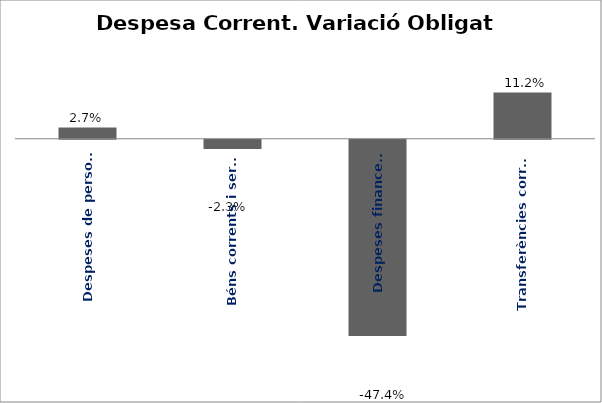
| Category | Series 0 |
|---|---|
| Despeses de personal | 0.027 |
| Béns corrents i serveis | -0.023 |
| Despeses financeres | -0.474 |
| Transferències corrents | 0.112 |